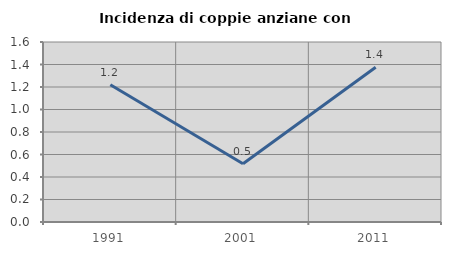
| Category | Incidenza di coppie anziane con figli |
|---|---|
| 1991.0 | 1.22 |
| 2001.0 | 0.518 |
| 2011.0 | 1.376 |